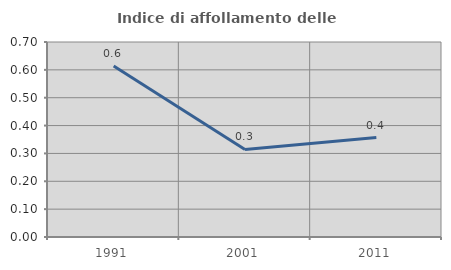
| Category | Indice di affollamento delle abitazioni  |
|---|---|
| 1991.0 | 0.613 |
| 2001.0 | 0.314 |
| 2011.0 | 0.357 |